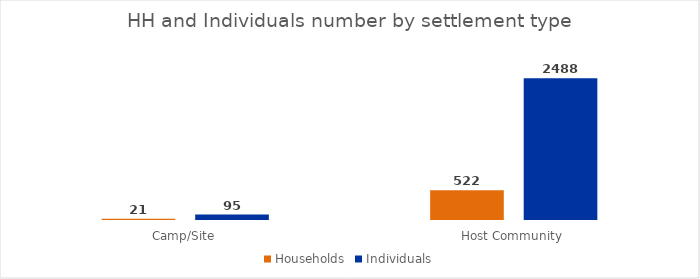
| Category | Households | Individuals |
|---|---|---|
| Camp/Site | 21 | 95 |
| Host Community | 522 | 2488 |